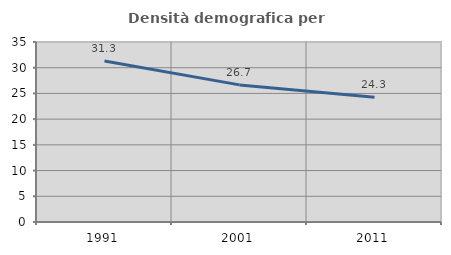
| Category | Densità demografica |
|---|---|
| 1991.0 | 31.31 |
| 2001.0 | 26.66 |
| 2011.0 | 24.251 |